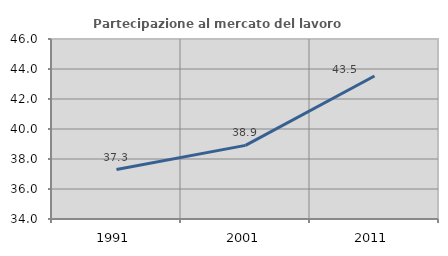
| Category | Partecipazione al mercato del lavoro  femminile |
|---|---|
| 1991.0 | 37.294 |
| 2001.0 | 38.908 |
| 2011.0 | 43.533 |